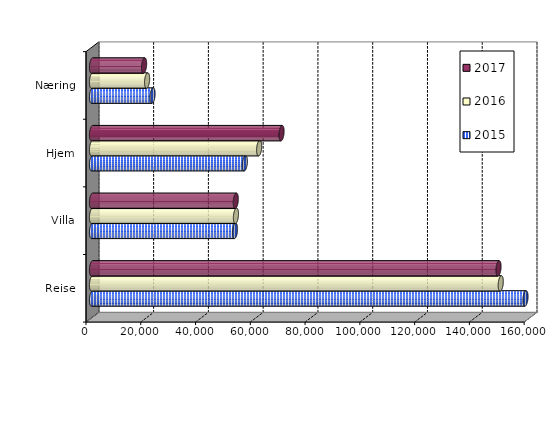
| Category | 2015 | 2016 | 2017 |
|---|---|---|---|
| Reise | 158299 | 149261.141 | 148449 |
| Villa | 52228.503 | 52562.962 | 52500.266 |
| Hjem | 55817.752 | 61041.058 | 69216.435 |
| Næring | 22114.084 | 20119.271 | 19019.624 |